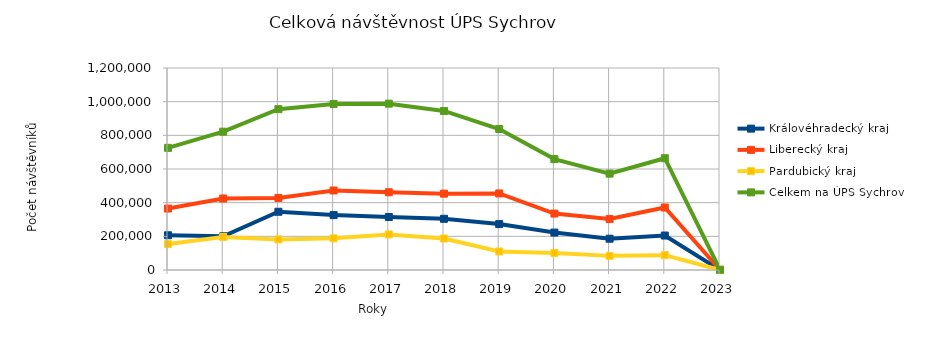
| Category | Královéhradecký kraj | Liberecký kraj | Pardubický kraj | Celkem na ÚPS Sychrov |
|---|---|---|---|---|
| 2013.0 | 206419 | 365108 | 154165 | 725692 |
| 2014.0 | 200438 | 424718 | 196473 | 821629 |
| 2015.0 | 345970 | 428023 | 181567 | 955560 |
| 2016.0 | 326137 | 472318 | 188108 | 986563 |
| 2017.0 | 314983 | 461803 | 211268 | 988054 |
| 2018.0 | 304267 | 453568 | 187017 | 944852 |
| 2019.0 | 272720 | 454785 | 109949 | 837454 |
| 2020.0 | 222238 | 335261 | 101211 | 658710 |
| 2021.0 | 185934 | 302574 | 83925 | 572433 |
| 2022.0 | 204678 | 371041 | 88282 | 664001 |
| 2023.0 | 28 | 1073 | 267 | 1368 |